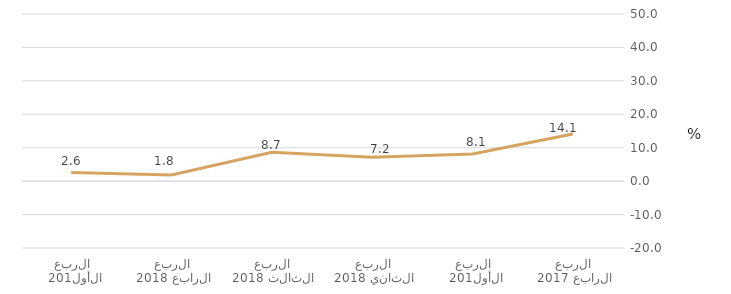
| Category | قطاع الحكومة العامة |
|---|---|
| الربع الرابع 2017 | 14.095 |
| الربع الأول 2018 | 8.098 |
| الربع الثاني 2018 | 7.179 |
| الربع الثالث 2018 | 8.668 |
| الربع الرابع 2018 | 1.85 |
| الربع الأول 2019 | 2.587 |